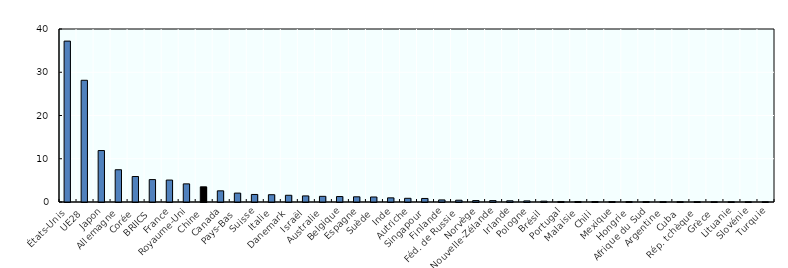
| Category | Series 0 |
|---|---|
| États-Unis | 37.202 |
| UE28 | 28.145 |
| Japon | 11.894 |
| Allemagne | 7.46 |
| Corée | 5.89 |
| BRIICS | 5.182 |
| France | 5.076 |
| Royaume-Uni | 4.191 |
| Chine | 3.507 |
| Canada | 2.58 |
| Pays-Bas | 2.058 |
| Suisse | 1.742 |
| Italie | 1.684 |
| Danemark | 1.555 |
| Israël | 1.406 |
| Australie | 1.31 |
| Belgique | 1.259 |
| Espagne | 1.203 |
| Suède | 1.157 |
| Inde | 0.958 |
| Autriche | 0.856 |
| Singapour | 0.818 |
| Finlande | 0.481 |
| Féd. de Russie | 0.412 |
| Norvège | 0.332 |
| Nouvelle-Zélande | 0.32 |
| Irlande | 0.279 |
| Pologne | 0.255 |
| Brésil | 0.192 |
| Portugal | 0.12 |
| Malaisie | 0.116 |
| Chili | 0.115 |
| Mexique | 0.111 |
| Hongrie | 0.11 |
| Afrique du Sud | 0.102 |
| Argentine | 0.085 |
| Cuba | 0.082 |
| Rép. tchèque | 0.082 |
| Grèce | 0.061 |
| Lituanie | 0.056 |
| Slovénie | 0.056 |
| Turquie | 0.052 |